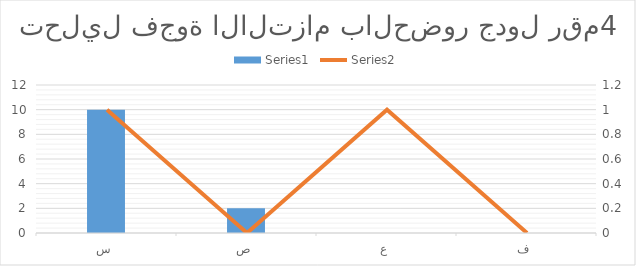
| Category | Series 0 |
|---|---|
| س | 10 |
| ص | 2 |
| ع | 0 |
| ف | 0 |